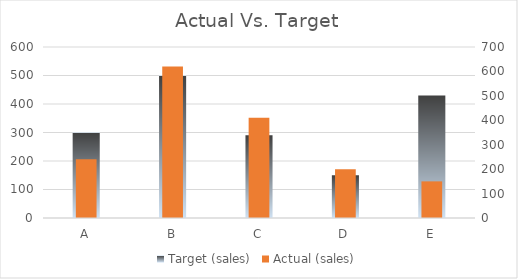
| Category | Target (sales) |
|---|---|
| A | 300 |
| B | 500 |
| C | 290 |
| D | 150 |
| E | 430 |